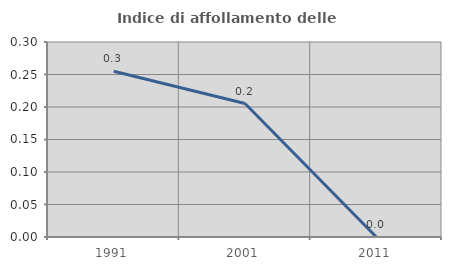
| Category | Indice di affollamento delle abitazioni  |
|---|---|
| 1991.0 | 0.255 |
| 2001.0 | 0.205 |
| 2011.0 | 0 |